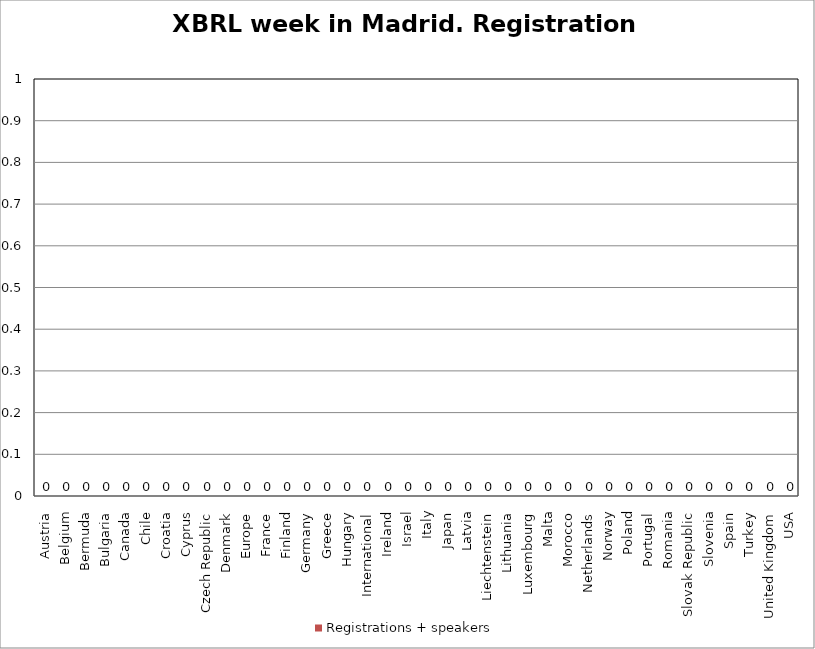
| Category | Country | Registrations + speakers |
|---|---|---|
| Austria | 0 | 0 |
| Belgium | 0 | 0 |
| Bermuda | 0 | 0 |
| Bulgaria | 0 | 0 |
| Canada | 0 | 0 |
| Chile | 0 | 0 |
| Croatia | 0 | 0 |
| Cyprus | 0 | 0 |
| Czech Republic | 0 | 0 |
| Denmark | 0 | 0 |
| Europe | 0 | 0 |
| France | 0 | 0 |
| Finland | 0 | 0 |
| Germany | 0 | 0 |
| Greece | 0 | 0 |
| Hungary | 0 | 0 |
| International | 0 | 0 |
| Ireland | 0 | 0 |
| Israel | 0 | 0 |
| Italy | 0 | 0 |
| Japan | 0 | 0 |
| Latvia | 0 | 0 |
| Liechtenstein | 0 | 0 |
| Lithuania | 0 | 0 |
| Luxembourg | 0 | 0 |
| Malta | 0 | 0 |
| Morocco | 0 | 0 |
| Netherlands | 0 | 0 |
| Norway | 0 | 0 |
| Poland | 0 | 0 |
| Portugal | 0 | 0 |
| Romania | 0 | 0 |
| Slovak Republic | 0 | 0 |
| Slovenia | 0 | 0 |
| Spain | 0 | 0 |
| Turkey | 0 | 0 |
| United Kingdom | 0 | 0 |
| USA | 0 | 0 |